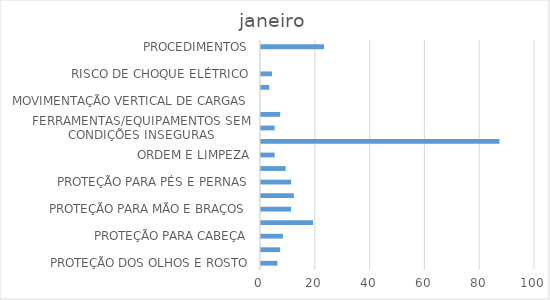
| Category | Series 0 |
|---|---|
| PROTEÇÃO DOS OLHOS E ROSTO | 6 |
| PROTEÇÃO AUDITIVA | 7 |
| PROTEÇÃO PARA CABEÇA | 8 |
| PROTEÇÃO RESPIRATÓRIA | 19 |
| PROTEÇÃO PARA MÃO E BRAÇOS | 11 |
| PROTEÇÃO CONTRA QUEDAS | 12 |
| PROTEÇÃO PARA PÉS E PERNAS | 11 |
| TRONCO | 9 |
| ORDEM E LIMPEZA | 5 |
| BATER CONTRA/SER ATINGIDO POR | 87 |
| FERRAMENTAS/EQUIPAMENTOS SEM CONDIÇÕES INSEGURAS | 5 |
| MATERIAIS ESTOCADOS EM LOCAL INADEQUADO | 7 |
| MOVIMENTAÇÃO VERTICAL DE CARGAS | 0 |
| POSTURA INADEQUADA | 3 |
| RISCO DE CHOQUE ELÉTRICO | 4 |
| RISCO DE QUEDA | 0 |
| PROCEDIMENTOS | 23 |